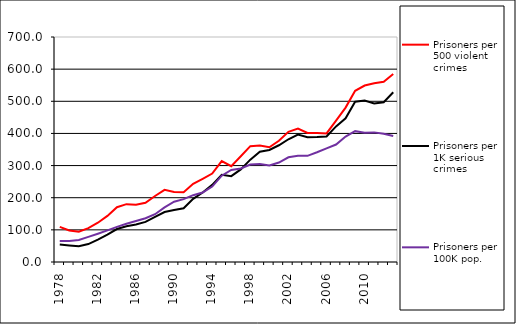
| Category | Prisoners per 500 violent crimes | Prisoners per 1K serious crimes | Prisoners per 100K pop. |
|---|---|---|---|
| 1978.0 | 109.126 | 54.72 | 65.719 |
| 1979.0 | 98.191 | 51.646 | 65.51 |
| 1980.0 | 94.255 | 48.917 | 68.605 |
| 1981.0 | 105.331 | 55.81 | 78.313 |
| 1982.0 | 122.15 | 69.824 | 88.057 |
| 1983.0 | 143.433 | 85.265 | 98.352 |
| 1984.0 | 170.336 | 102.612 | 109.218 |
| 1985.0 | 179.906 | 111.474 | 119.118 |
| 1986.0 | 177.872 | 116.662 | 127.555 |
| 1987.0 | 184.249 | 124.716 | 136.109 |
| 1988.0 | 205.391 | 140.452 | 148.69 |
| 1989.0 | 224.389 | 155.561 | 169.917 |
| 1990.0 | 217.533 | 161.647 | 187.525 |
| 1991.0 | 217.245 | 167.165 | 195.519 |
| 1992.0 | 243.447 | 196.413 | 207.894 |
| 1993.0 | 258.922 | 216.285 | 216.177 |
| 1994.0 | 275.1 | 239.997 | 234.766 |
| 1995.0 | 314.136 | 271.438 | 268.472 |
| 1996.0 | 298.204 | 267.171 | 286.455 |
| 1997.0 | 328.914 | 288.049 | 290.824 |
| 1998.0 | 360.343 | 318.372 | 303.083 |
| 1999.0 | 362.128 | 343.061 | 304.527 |
| 2000.0 | 357.126 | 348.69 | 300.007 |
| 2001.0 | 377.31 | 363.219 | 309.328 |
| 2002.0 | 405.059 | 381.831 | 325.773 |
| 2003.0 | 415.363 | 396.401 | 330.457 |
| 2004.0 | 401.3 | 388.189 | 330.236 |
| 2005.0 | 401.291 | 388.861 | 341.345 |
| 2006.0 | 400.055 | 390.299 | 353.664 |
| 2007.0 | 439.831 | 421.886 | 365.533 |
| 2008.0 | 480.382 | 446.95 | 390.304 |
| 2009.0 | 532.456 | 498.407 | 407.116 |
| 2010.0 | 549.028 | 502.286 | 402.09 |
| 2011.0 | 556.301 | 493.399 | 403.25 |
| 2012.0 | 560.969 | 497.13 | 398.904 |
| 2013.0 | 584.74 | 528.162 | 391.846 |